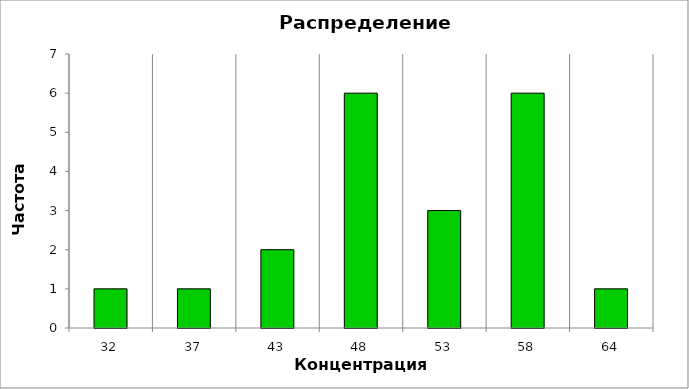
| Category | Series 0 |
|---|---|
| 32.0 | 1 |
| 37.261158609373844 | 1 |
| 42.52231721874769 | 2 |
| 47.78347582812153 | 6 |
| 53.044634437495375 | 3 |
| 58.30579304686922 | 6 |
| 63.56695165624306 | 1 |